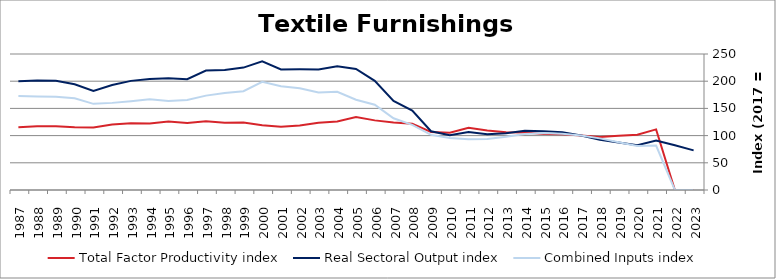
| Category | Total Factor Productivity index | Real Sectoral Output index | Combined Inputs index |
|---|---|---|---|
| 2023.0 | 0 | 72.844 | 0 |
| 2022.0 | 0 | 82.397 | 0 |
| 2021.0 | 111.422 | 91.023 | 81.692 |
| 2020.0 | 101.412 | 82.115 | 80.972 |
| 2019.0 | 99.684 | 87.394 | 87.671 |
| 2018.0 | 97.467 | 92.5 | 94.903 |
| 2017.0 | 100 | 100 | 100 |
| 2016.0 | 102.515 | 106.102 | 103.499 |
| 2015.0 | 102.929 | 107.789 | 104.722 |
| 2014.0 | 105.91 | 108.948 | 102.868 |
| 2013.0 | 106.275 | 104.111 | 97.964 |
| 2012.0 | 109.48 | 102.598 | 93.714 |
| 2011.0 | 114.379 | 106.623 | 93.219 |
| 2010.0 | 105.301 | 100.725 | 95.655 |
| 2009.0 | 106.632 | 108.015 | 101.297 |
| 2008.0 | 121.94 | 145.861 | 119.617 |
| 2007.0 | 124.16 | 163.642 | 131.799 |
| 2006.0 | 127.97 | 200.665 | 156.807 |
| 2005.0 | 134.209 | 222.606 | 165.865 |
| 2004.0 | 125.97 | 227.31 | 180.448 |
| 2003.0 | 123.649 | 221.45 | 179.096 |
| 2002.0 | 118.566 | 221.796 | 187.066 |
| 2001.0 | 116.121 | 221.548 | 190.79 |
| 2000.0 | 119.102 | 236.695 | 198.733 |
| 1999.0 | 123.94 | 225.001 | 181.541 |
| 1998.0 | 123.602 | 220.472 | 178.372 |
| 1997.0 | 126.513 | 219.491 | 173.493 |
| 1996.0 | 122.982 | 203.725 | 165.654 |
| 1995.0 | 125.757 | 205.632 | 163.516 |
| 1994.0 | 122.405 | 203.975 | 166.639 |
| 1993.0 | 122.92 | 200.604 | 163.2 |
| 1992.0 | 120.445 | 192.896 | 160.153 |
| 1991.0 | 114.98 | 182.062 | 158.341 |
| 1990.0 | 115.27 | 194.453 | 168.694 |
| 1989.0 | 117.344 | 200.904 | 171.209 |
| 1988.0 | 117.172 | 201.225 | 171.735 |
| 1987.0 | 115.568 | 199.72 | 172.817 |